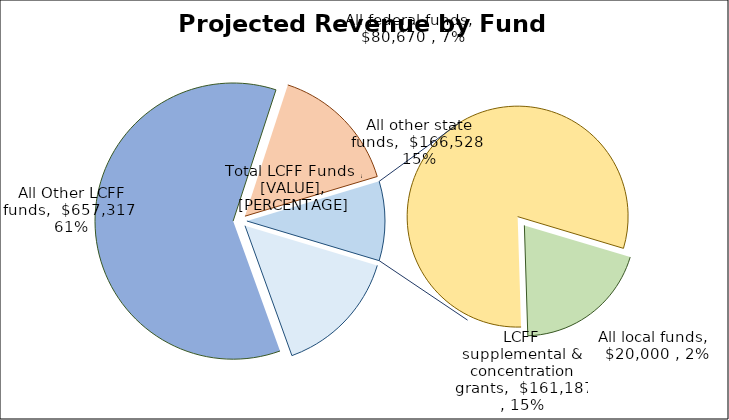
| Category | Series 0 |
|---|---|
| LCFF supplemental & concentration grants | 161187 |
| All Other LCFF funds | 657317 |
| All other state funds | 166528 |
| All local funds | 20000 |
| All federal funds | 80670 |